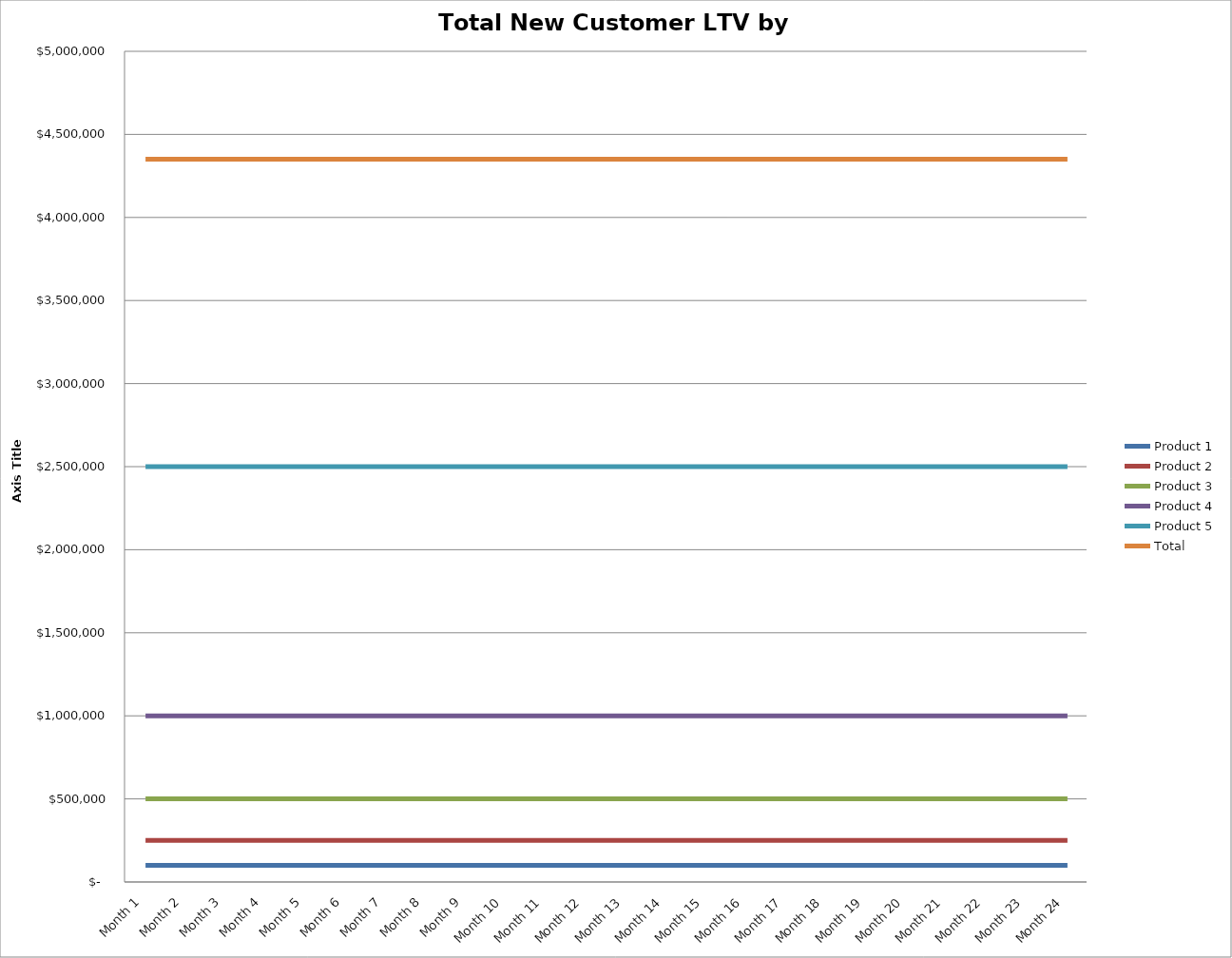
| Category | Product 1 | Product 2 | Product 3 | Product 4 | Product 5 | Total |
|---|---|---|---|---|---|---|
| Month 1 | 100000 | 250000 | 500000 | 1000000 | 2500000 | 4350000 |
| Month 2 | 100000 | 250000 | 500000 | 1000000 | 2500000 | 4350000 |
| Month 3 | 100000 | 250000 | 500000 | 1000000 | 2500000 | 4350000 |
| Month 4 | 100000 | 250000 | 500000 | 1000000 | 2500000 | 4350000 |
| Month 5 | 100000 | 250000 | 500000 | 1000000 | 2500000 | 4350000 |
| Month 6 | 100000 | 250000 | 500000 | 1000000 | 2500000 | 4350000 |
| Month 7 | 100000 | 250000 | 500000 | 1000000 | 2500000 | 4350000 |
| Month 8 | 100000 | 250000 | 500000 | 1000000 | 2500000 | 4350000 |
| Month 9 | 100000 | 250000 | 500000 | 1000000 | 2500000 | 4350000 |
| Month 10 | 100000 | 250000 | 500000 | 1000000 | 2500000 | 4350000 |
| Month 11 | 100000 | 250000 | 500000 | 1000000 | 2500000 | 4350000 |
| Month 12 | 100000 | 250000 | 500000 | 1000000 | 2500000 | 4350000 |
| Month 13 | 100000 | 250000 | 500000 | 1000000 | 2500000 | 4350000 |
| Month 14 | 100000 | 250000 | 500000 | 1000000 | 2500000 | 4350000 |
| Month 15 | 100000 | 250000 | 500000 | 1000000 | 2500000 | 4350000 |
| Month 16 | 100000 | 250000 | 500000 | 1000000 | 2500000 | 4350000 |
| Month 17 | 100000 | 250000 | 500000 | 1000000 | 2500000 | 4350000 |
| Month 18 | 100000 | 250000 | 500000 | 1000000 | 2500000 | 4350000 |
| Month 19 | 100000 | 250000 | 500000 | 1000000 | 2500000 | 4350000 |
| Month 20 | 100000 | 250000 | 500000 | 1000000 | 2500000 | 4350000 |
| Month 21 | 100000 | 250000 | 500000 | 1000000 | 2500000 | 4350000 |
| Month 22 | 100000 | 250000 | 500000 | 1000000 | 2500000 | 4350000 |
| Month 23 | 100000 | 250000 | 500000 | 1000000 | 2500000 | 4350000 |
| Month 24 | 100000 | 250000 | 500000 | 1000000 | 2500000 | 4350000 |